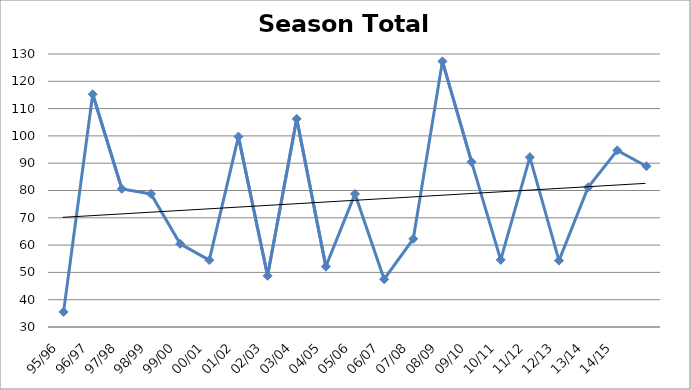
| Category | Series 0 |
|---|---|
| 95/96 | 35.55 |
| 96/97 | 115.25 |
| 97/98 | 80.6 |
| 98/99 | 78.75 |
| 99/00 | 60.45 |
| 00/01 | 54.5 |
| 01/02 | 99.75 |
| 02/03 | 48.75 |
| 03/04 | 106.25 |
| 04/05 | 52.125 |
| 05/06 | 78.75 |
| 06/07 | 47.5 |
| 07/08 | 62.3 |
| 08/09 | 127.3 |
| 09/10 | 90.5 |
| 10/11 | 54.61 |
| 11/12 | 92.2 |
| 12/13 | 54.31 |
| 13/14 | 81.2 |
| 14/15 | 94.7 |